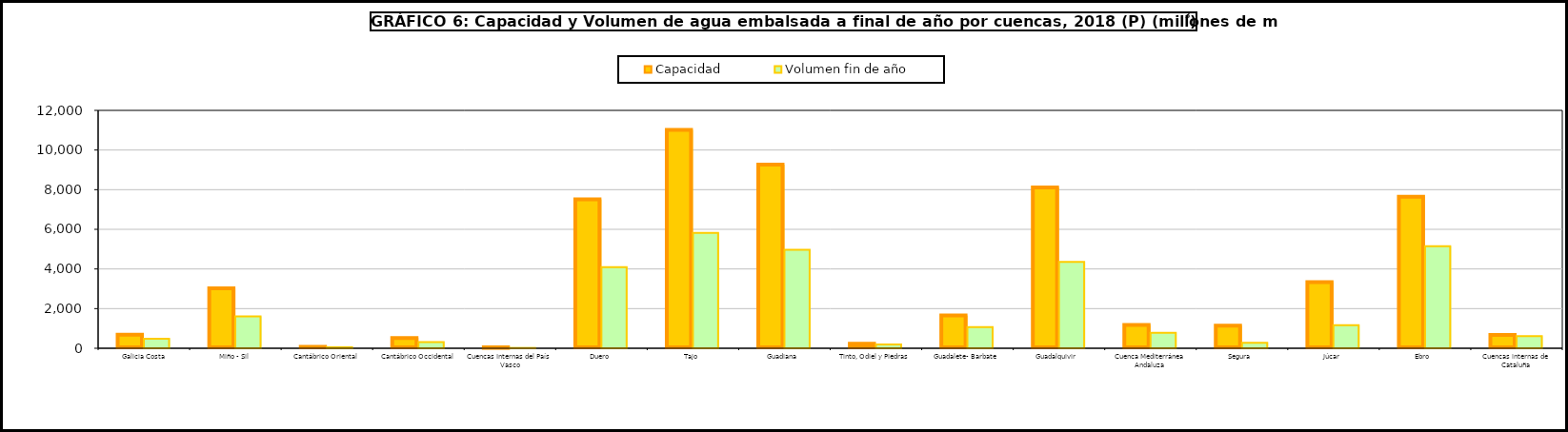
| Category | Capacidad | Volumen fin de año |
|---|---|---|
| Galicia Costa | 684 | 481 |
| Miño - Sil | 3030 | 1604 |
| Cantábrico Oriental | 73 | 54 |
| Cantábrico Occidental | 518 | 316 |
| Cuencas Internas del País Vasco | 21 | 16 |
| Duero  | 7507 | 4094 |
| Tajo  | 11012 | 5816 |
| Guadiana  | 9261 | 4964 |
| Tinto, Odiel y Piedras | 229 | 191 |
| Guadalete- Barbate | 1651 | 1069 |
| Guadalquivir  | 8118 | 4356 |
| Cuenca Mediterránea Andaluza | 1174 | 778 |
| Segura  | 1140 | 280 |
| Júcar  | 3337 | 1163 |
| Ebro  | 7642 | 5145 |
| Cuencas internas de Cataluña | 677 | 609 |